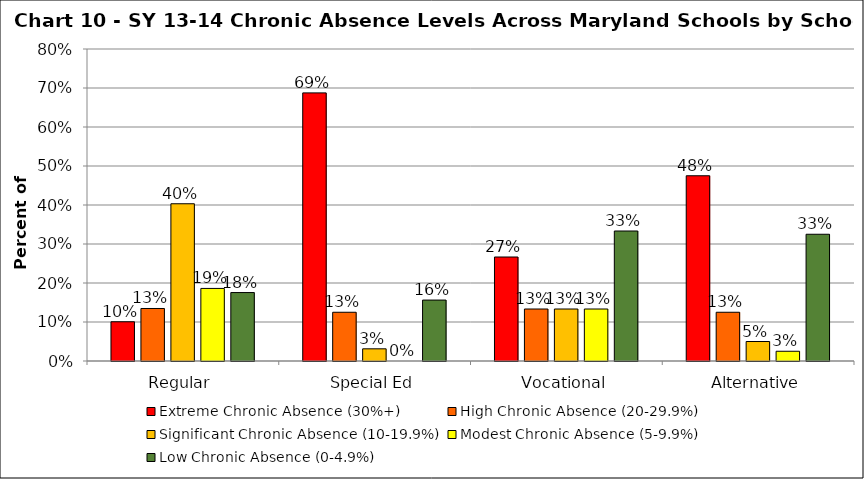
| Category | Extreme Chronic Absence (30%+) | High Chronic Absence (20-29.9%) | Significant Chronic Absence (10-19.9%) | Modest Chronic Absence (5-9.9%) | Low Chronic Absence (0-4.9%) |
|---|---|---|---|---|---|
| 0 | 0.101 | 0.135 | 0.403 | 0.186 | 0.175 |
| 1 | 0.688 | 0.125 | 0.031 | 0 | 0.156 |
| 2 | 0.267 | 0.133 | 0.133 | 0.133 | 0.333 |
| 3 | 0.475 | 0.125 | 0.05 | 0.025 | 0.325 |